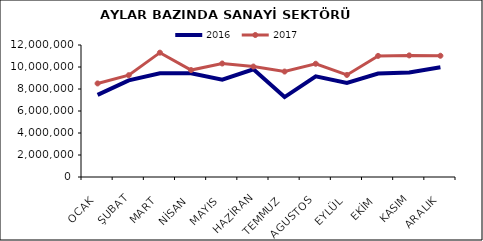
| Category | 2016 | 2017 |
|---|---|---|
| OCAK | 7469153.782 | 8506165.999 |
| ŞUBAT | 8788476.782 | 9255448.987 |
| MART | 9424981.181 | 11303797.142 |
| NİSAN | 9435675.914 | 9721966.52 |
| MAYIS | 8852339.673 | 10318403.034 |
| HAZİRAN | 9788352.784 | 10041357.95 |
| TEMMUZ | 7265834.048 | 9586423.485 |
| AGUSTOS | 9145801.028 | 10295271.485 |
| EYLÜL | 8542473.534 | 9278299.092 |
| EKİM | 9410593.039 | 11009566.392 |
| KASIM | 9506871.199 | 11053892.321 |
| ARALIK | 9969487.754 | 11022180.286 |